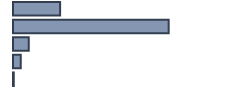
| Category | Series 0 |
|---|---|
| 0 | 20.753 |
| 1 | 68.577 |
| 2 | 6.917 |
| 3 | 3.415 |
| 4 | 0.337 |